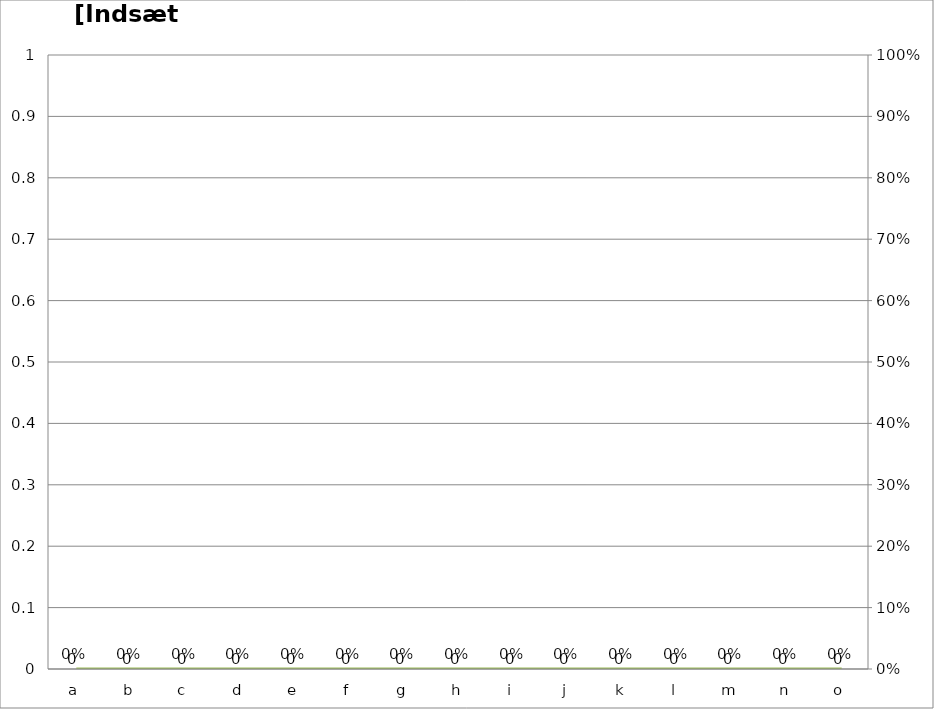
| Category | Series 0 |
|---|---|
| a | 0 |
| b | 0 |
| c | 0 |
| d | 0 |
| e | 0 |
| f | 0 |
| g | 0 |
| h | 0 |
| i | 0 |
| j | 0 |
| k | 0 |
| l | 0 |
| m | 0 |
| n | 0 |
| o | 0 |